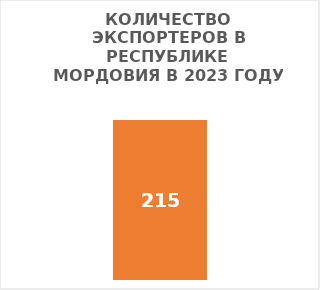
| Category | Итог |
|---|---|
| Итог | 215 |